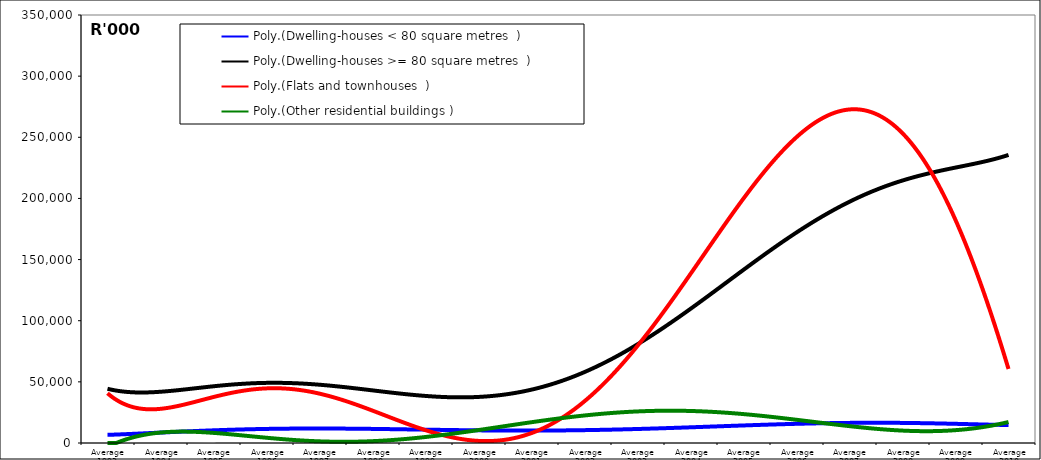
| Category | Dwelling-houses < 80 square metres | Dwelling-houses >= 80 square metres | Flats and townhouses | Other residential buildings |
|---|---|---|---|---|
| Average 1993 | 7002.667 | 42072.5 | 37568.5 | 689.333 |
| Average 1994 | 7902.917 | 43885.417 | 32276.333 | 1638.583 |
| Average 1995 | 9582.167 | 54860.083 | 45983.667 | 616.667 |
| Average 1996 | 13226 | 42982.417 | 33921 | 18173.583 |
| Average 1997 | 11608.667 | 40045.833 | 36993.583 | 4863.167 |
| Average 1998 | 10853.75 | 42286.417 | 21509.583 | 2381.5 |
| Average 1999 | 12713.167 | 38590.333 | 12462.667 | 805.75 |
| Average 2000 | 9060.417 | 48559.333 | 15927 | 2071.25 |
| Average 2001 | 8356.25 | 43928.5 | 17016.917 | 6879.833 |
| Average 2002 | 7887.167 | 59042 | 27388.75 | 41644.167 |
| Average 2003 | 18388.25 | 80922.667 | 68202.333 | 5816.5 |
| Average 2004 | 13124.583 | 102830.333 | 105660.917 | 66929.25 |
| Average 2005 | 11437.083 | 129995.083 | 259275.417 | 2795.5 |
| Average 2006 | 13410.833 | 177164.083 | 225838.583 | 12914.083 |
| Average 2007 | 17393.667 | 202611.167 | 257191.75 | 9037 |
| Average 2008 | 19304.25 | 238379.083 | 287895 | 13261.333 |
| Average 2009 | 13629.75 | 193406.167 | 156058.667 | 18246.917 |
| Average 2010 | 15037.875 | 245672.125 | 67710.125 | 13156.875 |